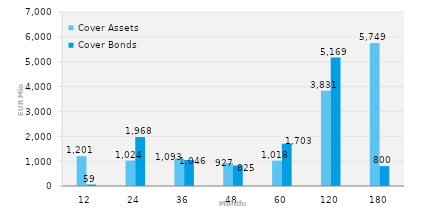
| Category | Cover Assets | Cover Bonds |
|---|---|---|
| 12.0 | 1200.953 | 59.379 |
| 24.0 | 1023.594 | 1968.275 |
| 36.0 | 1092.983 | 1046 |
| 48.0 | 926.919 | 825 |
| 60.0 | 1017.711 | 1702.5 |
| 120.0 | 3830.848 | 5169.249 |
| 180.0 | 5748.767 | 800.042 |